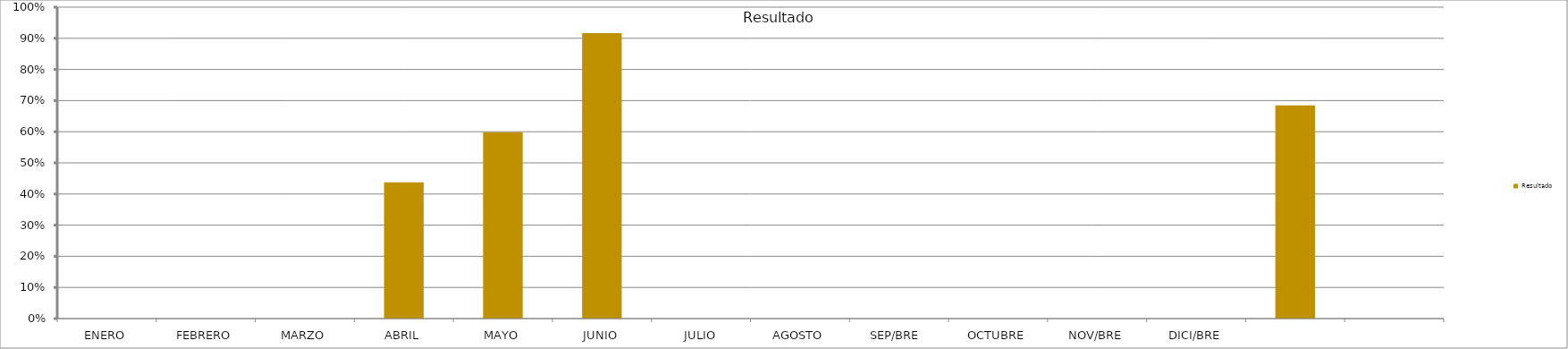
| Category | Resultado  |
|---|---|
| ENERO | 0 |
| FEBRERO | 0 |
| MARZO | 0 |
| ABRIL | 0.437 |
| MAYO | 0.599 |
| JUNIO | 0.917 |
| JULIO | 0 |
| AGOSTO | 0 |
| SEP/BRE  | 0 |
| OCTUBRE | 0 |
| NOV/BRE | 0 |
| DICI/BRE | 0 |